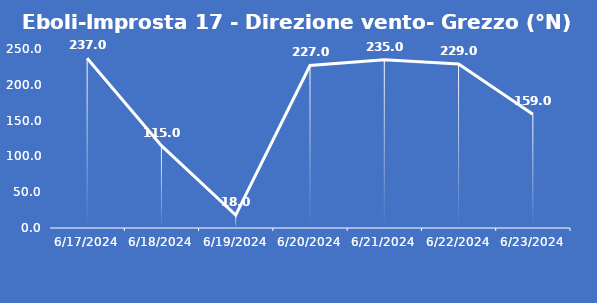
| Category | Eboli-Improsta 17 - Direzione vento- Grezzo (°N) |
|---|---|
| 6/17/24 | 237 |
| 6/18/24 | 115 |
| 6/19/24 | 18 |
| 6/20/24 | 227 |
| 6/21/24 | 235 |
| 6/22/24 | 229 |
| 6/23/24 | 159 |